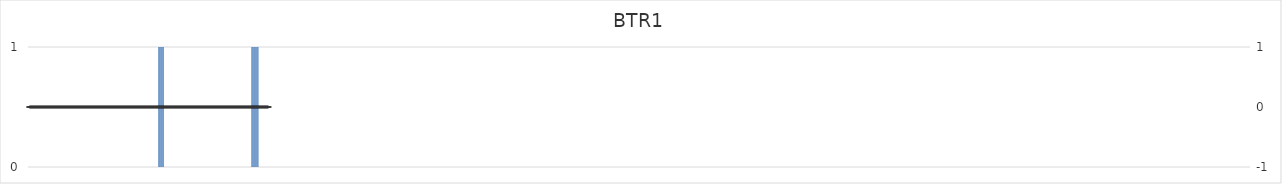
| Category | BTR1 |
|---|---|
| 1.0 | 0 |
| 2.0 | 0 |
| 3.0 | 0 |
| 4.0 | 0 |
| 5.0 | 0 |
| 6.0 | 0 |
| 7.0 | 0 |
| 8.0 | 0 |
| 9.0 | 0 |
| 10.0 | 0 |
| 11.0 | 0 |
| 12.0 | 0 |
| 13.0 | 0 |
| 14.0 | 0 |
| 15.0 | 0 |
| 16.0 | 0 |
| 17.0 | 0 |
| 18.0 | 0 |
| 19.0 | 0 |
| 20.0 | 0 |
| 21.0 | 0 |
| 22.0 | 0 |
| 23.0 | 0 |
| 24.0 | 0 |
| 25.0 | 0 |
| 26.0 | 0 |
| 27.0 | 0 |
| 28.0 | 0 |
| 29.0 | 0 |
| 30.0 | 0 |
| 31.0 | 0 |
| 32.0 | 0 |
| 33.0 | 0 |
| 34.0 | 0 |
| 35.0 | 0 |
| 36.0 | 0 |
| 37.0 | 0 |
| 38.0 | 0 |
| 39.0 | 0 |
| 40.0 | 0 |
| 41.0 | 0 |
| 42.0 | 0 |
| 43.0 | 0 |
| 44.0 | 0 |
| 45.0 | 0 |
| 46.0 | 0 |
| 47.0 | 0 |
| 48.0 | 0 |
| 49.0 | 0 |
| 50.0 | 0 |
| 51.0 | 0 |
| 52.0 | 0 |
| 53.0 | 0 |
| 54.0 | 0 |
| 55.0 | 0 |
| 56.0 | 0 |
| 57.0 | 0 |
| 58.0 | 0 |
| 59.0 | 0 |
| 60.0 | 0 |
| 61.0 | 0 |
| 62.0 | 0 |
| 63.0 | 0 |
| 64.0 | 0 |
| 65.0 | 0 |
| 66.0 | 0 |
| 67.0 | 0 |
| 68.0 | 0 |
| 69.0 | 0 |
| 70.0 | 0 |
| 71.0 | 0 |
| 72.0 | 0 |
| 73.0 | 0 |
| 74.0 | 0 |
| 75.0 | 0 |
| 76.0 | 0 |
| 77.0 | 0 |
| 78.0 | 0 |
| 79.0 | 0 |
| 80.0 | 0 |
| 81.0 | 0 |
| 82.0 | 0 |
| 83.0 | 0 |
| 84.0 | 0 |
| 85.0 | 0 |
| 86.0 | 0 |
| 87.0 | 0 |
| 88.0 | 0 |
| 89.0 | 0 |
| 90.0 | 0 |
| 91.0 | 0 |
| 92.0 | 0 |
| 93.0 | 0 |
| 94.0 | 0 |
| 95.0 | 0 |
| 96.0 | 0 |
| 97.0 | 0 |
| 98.0 | 0 |
| 99.0 | 0 |
| 100.0 | 0 |
| 101.0 | 0 |
| 102.0 | 0 |
| 103.0 | 0 |
| 104.0 | 0 |
| 105.0 | 0 |
| 106.0 | 0 |
| 107.0 | 0 |
| 108.0 | 0 |
| 109.0 | 0 |
| 110.0 | 0 |
| 111.0 | 0 |
| 112.0 | 0 |
| 113.0 | 0 |
| 114.0 | 0 |
| 115.0 | 0 |
| 116.0 | 0 |
| 117.0 | 0 |
| 118.0 | 0 |
| 119.0 | 0 |
| 120.0 | 0 |
| 121.0 | 0 |
| 122.0 | 0 |
| 123.0 | 0 |
| 124.0 | 0 |
| 125.0 | 0 |
| 126.0 | 0 |
| 127.0 | 0 |
| 128.0 | 0 |
| 129.0 | 0 |
| 130.0 | 0 |
| 131.0 | 0 |
| 132.0 | 0 |
| 133.0 | 0 |
| 134.0 | 0 |
| 135.0 | 0 |
| 136.0 | 0 |
| 137.0 | 0 |
| 138.0 | 0 |
| 139.0 | 0 |
| 140.0 | 0 |
| 141.0 | 0 |
| 142.0 | 0 |
| 143.0 | 0 |
| 144.0 | 0 |
| 145.0 | 0 |
| 146.0 | 0 |
| 147.0 | 0 |
| 148.0 | 0 |
| 149.0 | 0 |
| 150.0 | 0 |
| 151.0 | 0 |
| 152.0 | 0 |
| 153.0 | 0 |
| 154.0 | 0 |
| 155.0 | 0 |
| 156.0 | 0 |
| 157.0 | 0 |
| 158.0 | 0 |
| 159.0 | 0 |
| 160.0 | 0 |
| 161.0 | 0 |
| 162.0 | 0 |
| 163.0 | 0 |
| 164.0 | 0 |
| 165.0 | 0 |
| 166.0 | 0 |
| 167.0 | 0 |
| 168.0 | 0 |
| 169.0 | 0 |
| 170.0 | 0 |
| 171.0 | 0 |
| 172.0 | 0 |
| 173.0 | 0 |
| 174.0 | 0 |
| 175.0 | 0 |
| 176.0 | 0 |
| 177.0 | 0 |
| 178.0 | 0 |
| 179.0 | 0 |
| 180.0 | 0 |
| 181.0 | 0 |
| 182.0 | 0 |
| 183.0 | 1 |
| 184.0 | 1 |
| 185.0 | 1 |
| 186.0 | 1 |
| 187.0 | 1 |
| 188.0 | 1 |
| 189.0 | 1 |
| 190.0 | 1 |
| 191.0 | 0 |
| 192.0 | 0 |
| 193.0 | 0 |
| 194.0 | 0 |
| 195.0 | 0 |
| 196.0 | 0 |
| 197.0 | 0 |
| 198.0 | 0 |
| 199.0 | 0 |
| 200.0 | 0 |
| 201.0 | 0 |
| 202.0 | 0 |
| 203.0 | 0 |
| 204.0 | 0 |
| 205.0 | 0 |
| 206.0 | 0 |
| 207.0 | 0 |
| 208.0 | 0 |
| 209.0 | 0 |
| 210.0 | 0 |
| 211.0 | 0 |
| 212.0 | 0 |
| 213.0 | 0 |
| 214.0 | 0 |
| 215.0 | 0 |
| 216.0 | 0 |
| 217.0 | 0 |
| 218.0 | 0 |
| 219.0 | 0 |
| 220.0 | 0 |
| 221.0 | 0 |
| 222.0 | 0 |
| 223.0 | 0 |
| 224.0 | 0 |
| 225.0 | 0 |
| 226.0 | 0 |
| 227.0 | 0 |
| 228.0 | 0 |
| 229.0 | 0 |
| 230.0 | 0 |
| 231.0 | 0 |
| 232.0 | 0 |
| 233.0 | 0 |
| 234.0 | 0 |
| 235.0 | 0 |
| 236.0 | 0 |
| 237.0 | 0 |
| 238.0 | 0 |
| 239.0 | 0 |
| 240.0 | 0 |
| 241.0 | 0 |
| 242.0 | 0 |
| 243.0 | 0 |
| 244.0 | 0 |
| 245.0 | 0 |
| 246.0 | 0 |
| 247.0 | 0 |
| 248.0 | 0 |
| 249.0 | 0 |
| 250.0 | 0 |
| 251.0 | 0 |
| 252.0 | 0 |
| 253.0 | 0 |
| 254.0 | 0 |
| 255.0 | 0 |
| 256.0 | 0 |
| 257.0 | 0 |
| 258.0 | 0 |
| 259.0 | 0 |
| 260.0 | 0 |
| 261.0 | 0 |
| 262.0 | 0 |
| 263.0 | 0 |
| 264.0 | 0 |
| 265.0 | 0 |
| 266.0 | 0 |
| 267.0 | 0 |
| 268.0 | 0 |
| 269.0 | 0 |
| 270.0 | 0 |
| 271.0 | 0 |
| 272.0 | 0 |
| 273.0 | 0 |
| 274.0 | 0 |
| 275.0 | 0 |
| 276.0 | 0 |
| 277.0 | 0 |
| 278.0 | 0 |
| 279.0 | 0 |
| 280.0 | 0 |
| 281.0 | 0 |
| 282.0 | 0 |
| 283.0 | 0 |
| 284.0 | 0 |
| 285.0 | 0 |
| 286.0 | 0 |
| 287.0 | 0 |
| 288.0 | 0 |
| 289.0 | 0 |
| 290.0 | 0 |
| 291.0 | 0 |
| 292.0 | 0 |
| 293.0 | 0 |
| 294.0 | 0 |
| 295.0 | 0 |
| 296.0 | 0 |
| 297.0 | 0 |
| 298.0 | 0 |
| 299.0 | 0 |
| 300.0 | 0 |
| 301.0 | 0 |
| 302.0 | 0 |
| 303.0 | 0 |
| 304.0 | 0 |
| 305.0 | 0 |
| 306.0 | 0 |
| 307.0 | 0 |
| 308.0 | 0 |
| 309.0 | 0 |
| 310.0 | 0 |
| 311.0 | 0 |
| 312.0 | 0 |
| 313.0 | 1 |
| 314.0 | 1 |
| 315.0 | 1 |
| 316.0 | 1 |
| 317.0 | 1 |
| 318.0 | 1 |
| 319.0 | 1 |
| 320.0 | 1 |
| 321.0 | 1 |
| 322.0 | 1 |
| 323.0 | 0 |
| 324.0 | 0 |
| 325.0 | 0 |
| 326.0 | 0 |
| 327.0 | 0 |
| 328.0 | 0 |
| 329.0 | 0 |
| 330.0 | 0 |
| 331.0 | 0 |
| 332.0 | 0 |
| 333.0 | 0 |
| 334.0 | 0 |
| 335.0 | 0 |
| 336.0 | 0 |
| 337.0 | 0 |
| 338.0 | 0 |
| 339.0 | 0 |
| 340.0 | 0 |
| 341.0 | 0 |
| 342.0 | 0 |
| 343.0 | 0 |
| 344.0 | 0 |
| 345.0 | 0 |
| 346.0 | 0 |
| 347.0 | 0 |
| 348.0 | 0 |
| 349.0 | 0 |
| 350.0 | 0 |
| 351.0 | 0 |
| 352.0 | 0 |
| 353.0 | 0 |
| 354.0 | 0 |
| 355.0 | 0 |
| 356.0 | 0 |
| 357.0 | 0 |
| 358.0 | 0 |
| 359.0 | 0 |
| 360.0 | 0 |
| 361.0 | 0 |
| 362.0 | 0 |
| 363.0 | 0 |
| 364.0 | 0 |
| 365.0 | 0 |
| 366.0 | 0 |
| 367.0 | 0 |
| 368.0 | 0 |
| 369.0 | 0 |
| 370.0 | 0 |
| 371.0 | 0 |
| 372.0 | 0 |
| 373.0 | 0 |
| 374.0 | 0 |
| 375.0 | 0 |
| 376.0 | 0 |
| 377.0 | 0 |
| 378.0 | 0 |
| 379.0 | 0 |
| 380.0 | 0 |
| 381.0 | 0 |
| 382.0 | 0 |
| 383.0 | 0 |
| 384.0 | 0 |
| 385.0 | 0 |
| 386.0 | 0 |
| 387.0 | 0 |
| 388.0 | 0 |
| 389.0 | 0 |
| 390.0 | 0 |
| 391.0 | 0 |
| 392.0 | 0 |
| 393.0 | 0 |
| 394.0 | 0 |
| 395.0 | 0 |
| 396.0 | 0 |
| 397.0 | 0 |
| 398.0 | 0 |
| 399.0 | 0 |
| 400.0 | 0 |
| 401.0 | 0 |
| 402.0 | 0 |
| 403.0 | 0 |
| 404.0 | 0 |
| 405.0 | 0 |
| 406.0 | 0 |
| 407.0 | 0 |
| 408.0 | 0 |
| 409.0 | 0 |
| 410.0 | 0 |
| 411.0 | 0 |
| 412.0 | 0 |
| 413.0 | 0 |
| 414.0 | 0 |
| 415.0 | 0 |
| 416.0 | 0 |
| 417.0 | 0 |
| 418.0 | 0 |
| 419.0 | 0 |
| 420.0 | 0 |
| 421.0 | 0 |
| 422.0 | 0 |
| 423.0 | 0 |
| 424.0 | 0 |
| 425.0 | 0 |
| 426.0 | 0 |
| 427.0 | 0 |
| 428.0 | 0 |
| 429.0 | 0 |
| 430.0 | 0 |
| 431.0 | 0 |
| 432.0 | 0 |
| 433.0 | 0 |
| 434.0 | 0 |
| 435.0 | 0 |
| 436.0 | 0 |
| 437.0 | 0 |
| 438.0 | 0 |
| 439.0 | 0 |
| 440.0 | 0 |
| 441.0 | 0 |
| 442.0 | 0 |
| 443.0 | 0 |
| 444.0 | 0 |
| 445.0 | 0 |
| 446.0 | 0 |
| 447.0 | 0 |
| 448.0 | 0 |
| 449.0 | 0 |
| 450.0 | 0 |
| 451.0 | 0 |
| 452.0 | 0 |
| 453.0 | 0 |
| 454.0 | 0 |
| 455.0 | 0 |
| 456.0 | 0 |
| 457.0 | 0 |
| 458.0 | 0 |
| 459.0 | 0 |
| 460.0 | 0 |
| 461.0 | 0 |
| 462.0 | 0 |
| 463.0 | 0 |
| 464.0 | 0 |
| 465.0 | 0 |
| 466.0 | 0 |
| 467.0 | 0 |
| 468.0 | 0 |
| 469.0 | 0 |
| 470.0 | 0 |
| 471.0 | 0 |
| 472.0 | 0 |
| 473.0 | 0 |
| 474.0 | 0 |
| 475.0 | 0 |
| 476.0 | 0 |
| 477.0 | 0 |
| 478.0 | 0 |
| 479.0 | 0 |
| 480.0 | 0 |
| 481.0 | 0 |
| 482.0 | 0 |
| 483.0 | 0 |
| 484.0 | 0 |
| 485.0 | 0 |
| 486.0 | 0 |
| 487.0 | 0 |
| 488.0 | 0 |
| 489.0 | 0 |
| 490.0 | 0 |
| 491.0 | 0 |
| 492.0 | 0 |
| 493.0 | 0 |
| 494.0 | 0 |
| 495.0 | 0 |
| 496.0 | 0 |
| 497.0 | 0 |
| 498.0 | 0 |
| 499.0 | 0 |
| 500.0 | 0 |
| 501.0 | 0 |
| 502.0 | 0 |
| 503.0 | 0 |
| 504.0 | 0 |
| 505.0 | 0 |
| 506.0 | 0 |
| 507.0 | 0 |
| 508.0 | 0 |
| 509.0 | 0 |
| 510.0 | 0 |
| 511.0 | 0 |
| 512.0 | 0 |
| 513.0 | 0 |
| 514.0 | 0 |
| 515.0 | 0 |
| 516.0 | 0 |
| 517.0 | 0 |
| 518.0 | 0 |
| 519.0 | 0 |
| 520.0 | 0 |
| 521.0 | 0 |
| 522.0 | 0 |
| 523.0 | 0 |
| 524.0 | 0 |
| 525.0 | 0 |
| 526.0 | 0 |
| 527.0 | 0 |
| 528.0 | 0 |
| 529.0 | 0 |
| 530.0 | 0 |
| 531.0 | 0 |
| 532.0 | 0 |
| 533.0 | 0 |
| 534.0 | 0 |
| 535.0 | 0 |
| 536.0 | 0 |
| 537.0 | 0 |
| 538.0 | 0 |
| 539.0 | 0 |
| 540.0 | 0 |
| 541.0 | 0 |
| 542.0 | 0 |
| 543.0 | 0 |
| 544.0 | 0 |
| 545.0 | 0 |
| 546.0 | 0 |
| 547.0 | 0 |
| 548.0 | 0 |
| 549.0 | 0 |
| 550.0 | 0 |
| 551.0 | 0 |
| 552.0 | 0 |
| 553.0 | 0 |
| 554.0 | 0 |
| 555.0 | 0 |
| 556.0 | 0 |
| 557.0 | 0 |
| 558.0 | 0 |
| 559.0 | 0 |
| 560.0 | 0 |
| 561.0 | 0 |
| 562.0 | 0 |
| 563.0 | 0 |
| 564.0 | 0 |
| 565.0 | 0 |
| 566.0 | 0 |
| 567.0 | 0 |
| 568.0 | 0 |
| 569.0 | 0 |
| 570.0 | 0 |
| 571.0 | 0 |
| 572.0 | 0 |
| 573.0 | 0 |
| 574.0 | 0 |
| 575.0 | 0 |
| 576.0 | 0 |
| 577.0 | 0 |
| 578.0 | 0 |
| 579.0 | 0 |
| 580.0 | 0 |
| 581.0 | 0 |
| 582.0 | 0 |
| 583.0 | 0 |
| 584.0 | 0 |
| 585.0 | 0 |
| 586.0 | 0 |
| 587.0 | 0 |
| 588.0 | 0 |
| 589.0 | 0 |
| 590.0 | 0 |
| 591.0 | 0 |
| 592.0 | 0 |
| 593.0 | 0 |
| 594.0 | 0 |
| 595.0 | 0 |
| 596.0 | 0 |
| 597.0 | 0 |
| 598.0 | 0 |
| 599.0 | 0 |
| 600.0 | 0 |
| 601.0 | 0 |
| 602.0 | 0 |
| 603.0 | 0 |
| 604.0 | 0 |
| 605.0 | 0 |
| 606.0 | 0 |
| 607.0 | 0 |
| 608.0 | 0 |
| 609.0 | 0 |
| 610.0 | 0 |
| 611.0 | 0 |
| 612.0 | 0 |
| 613.0 | 0 |
| 614.0 | 0 |
| 615.0 | 0 |
| 616.0 | 0 |
| 617.0 | 0 |
| 618.0 | 0 |
| 619.0 | 0 |
| 620.0 | 0 |
| 621.0 | 0 |
| 622.0 | 0 |
| 623.0 | 0 |
| 624.0 | 0 |
| 625.0 | 0 |
| 626.0 | 0 |
| 627.0 | 0 |
| 628.0 | 0 |
| 629.0 | 0 |
| 630.0 | 0 |
| 631.0 | 0 |
| 632.0 | 0 |
| 633.0 | 0 |
| 634.0 | 0 |
| 635.0 | 0 |
| 636.0 | 0 |
| 637.0 | 0 |
| 638.0 | 0 |
| 639.0 | 0 |
| 640.0 | 0 |
| 641.0 | 0 |
| 642.0 | 0 |
| 643.0 | 0 |
| 644.0 | 0 |
| 645.0 | 0 |
| 646.0 | 0 |
| 647.0 | 0 |
| 648.0 | 0 |
| 649.0 | 0 |
| 650.0 | 0 |
| 651.0 | 0 |
| 652.0 | 0 |
| 653.0 | 0 |
| 654.0 | 0 |
| 655.0 | 0 |
| 656.0 | 0 |
| 657.0 | 0 |
| 658.0 | 0 |
| 659.0 | 0 |
| 660.0 | 0 |
| 661.0 | 0 |
| 662.0 | 0 |
| 663.0 | 0 |
| 664.0 | 0 |
| 665.0 | 0 |
| 666.0 | 0 |
| 667.0 | 0 |
| 668.0 | 0 |
| 669.0 | 0 |
| 670.0 | 0 |
| 671.0 | 0 |
| 672.0 | 0 |
| 673.0 | 0 |
| 674.0 | 0 |
| 675.0 | 0 |
| 676.0 | 0 |
| 677.0 | 0 |
| 678.0 | 0 |
| 679.0 | 0 |
| 680.0 | 0 |
| 681.0 | 0 |
| 682.0 | 0 |
| 683.0 | 0 |
| 684.0 | 0 |
| 685.0 | 0 |
| 686.0 | 0 |
| 687.0 | 0 |
| 688.0 | 0 |
| 689.0 | 0 |
| 690.0 | 0 |
| 691.0 | 0 |
| 692.0 | 0 |
| 693.0 | 0 |
| 694.0 | 0 |
| 695.0 | 0 |
| 696.0 | 0 |
| 697.0 | 0 |
| 698.0 | 0 |
| 699.0 | 0 |
| 700.0 | 0 |
| 701.0 | 0 |
| 702.0 | 0 |
| 703.0 | 0 |
| 704.0 | 0 |
| 705.0 | 0 |
| 706.0 | 0 |
| 707.0 | 0 |
| 708.0 | 0 |
| 709.0 | 0 |
| 710.0 | 0 |
| 711.0 | 0 |
| 712.0 | 0 |
| 713.0 | 0 |
| 714.0 | 0 |
| 715.0 | 0 |
| 716.0 | 0 |
| 717.0 | 0 |
| 718.0 | 0 |
| 719.0 | 0 |
| 720.0 | 0 |
| 721.0 | 0 |
| 722.0 | 0 |
| 723.0 | 0 |
| 724.0 | 0 |
| 725.0 | 0 |
| 726.0 | 0 |
| 727.0 | 0 |
| 728.0 | 0 |
| 729.0 | 0 |
| 730.0 | 0 |
| 731.0 | 0 |
| 732.0 | 0 |
| 733.0 | 0 |
| 734.0 | 0 |
| 735.0 | 0 |
| 736.0 | 0 |
| 737.0 | 0 |
| 738.0 | 0 |
| 739.0 | 0 |
| 740.0 | 0 |
| 741.0 | 0 |
| 742.0 | 0 |
| 743.0 | 0 |
| 744.0 | 0 |
| 745.0 | 0 |
| 746.0 | 0 |
| 747.0 | 0 |
| 748.0 | 0 |
| 749.0 | 0 |
| 750.0 | 0 |
| 751.0 | 0 |
| 752.0 | 0 |
| 753.0 | 0 |
| 754.0 | 0 |
| 755.0 | 0 |
| 756.0 | 0 |
| 757.0 | 0 |
| 758.0 | 0 |
| 759.0 | 0 |
| 760.0 | 0 |
| 761.0 | 0 |
| 762.0 | 0 |
| 763.0 | 0 |
| 764.0 | 0 |
| 765.0 | 0 |
| 766.0 | 0 |
| 767.0 | 0 |
| 768.0 | 0 |
| 769.0 | 0 |
| 770.0 | 0 |
| 771.0 | 0 |
| 772.0 | 0 |
| 773.0 | 0 |
| 774.0 | 0 |
| 775.0 | 0 |
| 776.0 | 0 |
| 777.0 | 0 |
| 778.0 | 0 |
| 779.0 | 0 |
| 780.0 | 0 |
| 781.0 | 0 |
| 782.0 | 0 |
| 783.0 | 0 |
| 784.0 | 0 |
| 785.0 | 0 |
| 786.0 | 0 |
| 787.0 | 0 |
| 788.0 | 0 |
| 789.0 | 0 |
| 790.0 | 0 |
| 791.0 | 0 |
| 792.0 | 0 |
| 793.0 | 0 |
| 794.0 | 0 |
| 795.0 | 0 |
| 796.0 | 0 |
| 797.0 | 0 |
| 798.0 | 0 |
| 799.0 | 0 |
| 800.0 | 0 |
| 801.0 | 0 |
| 802.0 | 0 |
| 803.0 | 0 |
| 804.0 | 0 |
| 805.0 | 0 |
| 806.0 | 0 |
| 807.0 | 0 |
| 808.0 | 0 |
| 809.0 | 0 |
| 810.0 | 0 |
| 811.0 | 0 |
| 812.0 | 0 |
| 813.0 | 0 |
| 814.0 | 0 |
| 815.0 | 0 |
| 816.0 | 0 |
| 817.0 | 0 |
| 818.0 | 0 |
| 819.0 | 0 |
| 820.0 | 0 |
| 821.0 | 0 |
| 822.0 | 0 |
| 823.0 | 0 |
| 824.0 | 0 |
| 825.0 | 0 |
| 826.0 | 0 |
| 827.0 | 0 |
| 828.0 | 0 |
| 829.0 | 0 |
| 830.0 | 0 |
| 831.0 | 0 |
| 832.0 | 0 |
| 833.0 | 0 |
| 834.0 | 0 |
| 835.0 | 0 |
| 836.0 | 0 |
| 837.0 | 0 |
| 838.0 | 0 |
| 839.0 | 0 |
| 840.0 | 0 |
| 841.0 | 0 |
| 842.0 | 0 |
| 843.0 | 0 |
| 844.0 | 0 |
| 845.0 | 0 |
| 846.0 | 0 |
| 847.0 | 0 |
| 848.0 | 0 |
| 849.0 | 0 |
| 850.0 | 0 |
| 851.0 | 0 |
| 852.0 | 0 |
| 853.0 | 0 |
| 854.0 | 0 |
| 855.0 | 0 |
| 856.0 | 0 |
| 857.0 | 0 |
| 858.0 | 0 |
| 859.0 | 0 |
| 860.0 | 0 |
| 861.0 | 0 |
| 862.0 | 0 |
| 863.0 | 0 |
| 864.0 | 0 |
| 865.0 | 0 |
| 866.0 | 0 |
| 867.0 | 0 |
| 868.0 | 0 |
| 869.0 | 0 |
| 870.0 | 0 |
| 871.0 | 0 |
| 872.0 | 0 |
| 873.0 | 0 |
| 874.0 | 0 |
| 875.0 | 0 |
| 876.0 | 0 |
| 877.0 | 0 |
| 878.0 | 0 |
| 879.0 | 0 |
| 880.0 | 0 |
| 881.0 | 0 |
| 882.0 | 0 |
| 883.0 | 0 |
| 884.0 | 0 |
| 885.0 | 0 |
| 886.0 | 0 |
| 887.0 | 0 |
| 888.0 | 0 |
| 889.0 | 0 |
| 890.0 | 0 |
| 891.0 | 0 |
| 892.0 | 0 |
| 893.0 | 0 |
| 894.0 | 0 |
| 895.0 | 0 |
| 896.0 | 0 |
| 897.0 | 0 |
| 898.0 | 0 |
| 899.0 | 0 |
| 900.0 | 0 |
| 901.0 | 0 |
| 902.0 | 0 |
| 903.0 | 0 |
| 904.0 | 0 |
| 905.0 | 0 |
| 906.0 | 0 |
| 907.0 | 0 |
| 908.0 | 0 |
| 909.0 | 0 |
| 910.0 | 0 |
| 911.0 | 0 |
| 912.0 | 0 |
| 913.0 | 0 |
| 914.0 | 0 |
| 915.0 | 0 |
| 916.0 | 0 |
| 917.0 | 0 |
| 918.0 | 0 |
| 919.0 | 0 |
| 920.0 | 0 |
| 921.0 | 0 |
| 922.0 | 0 |
| 923.0 | 0 |
| 924.0 | 0 |
| 925.0 | 0 |
| 926.0 | 0 |
| 927.0 | 0 |
| 928.0 | 0 |
| 929.0 | 0 |
| 930.0 | 0 |
| 931.0 | 0 |
| 932.0 | 0 |
| 933.0 | 0 |
| 934.0 | 0 |
| 935.0 | 0 |
| 936.0 | 0 |
| 937.0 | 0 |
| 938.0 | 0 |
| 939.0 | 0 |
| 940.0 | 0 |
| 941.0 | 0 |
| 942.0 | 0 |
| 943.0 | 0 |
| 944.0 | 0 |
| 945.0 | 0 |
| 946.0 | 0 |
| 947.0 | 0 |
| 948.0 | 0 |
| 949.0 | 0 |
| 950.0 | 0 |
| 951.0 | 0 |
| 952.0 | 0 |
| 953.0 | 0 |
| 954.0 | 0 |
| 955.0 | 0 |
| 956.0 | 0 |
| 957.0 | 0 |
| 958.0 | 0 |
| 959.0 | 0 |
| 960.0 | 0 |
| 961.0 | 0 |
| 962.0 | 0 |
| 963.0 | 0 |
| 964.0 | 0 |
| 965.0 | 0 |
| 966.0 | 0 |
| 967.0 | 0 |
| 968.0 | 0 |
| 969.0 | 0 |
| 970.0 | 0 |
| 971.0 | 0 |
| 972.0 | 0 |
| 973.0 | 0 |
| 974.0 | 0 |
| 975.0 | 0 |
| 976.0 | 0 |
| 977.0 | 0 |
| 978.0 | 0 |
| 979.0 | 0 |
| 980.0 | 0 |
| 981.0 | 0 |
| 982.0 | 0 |
| 983.0 | 0 |
| 984.0 | 0 |
| 985.0 | 0 |
| 986.0 | 0 |
| 987.0 | 0 |
| 988.0 | 0 |
| 989.0 | 0 |
| 990.0 | 0 |
| 991.0 | 0 |
| 992.0 | 0 |
| 993.0 | 0 |
| 994.0 | 0 |
| 995.0 | 0 |
| 996.0 | 0 |
| 997.0 | 0 |
| 998.0 | 0 |
| 999.0 | 0 |
| 1000.0 | 0 |
| 1001.0 | 0 |
| 1002.0 | 0 |
| 1003.0 | 0 |
| 1004.0 | 0 |
| 1005.0 | 0 |
| 1006.0 | 0 |
| 1007.0 | 0 |
| 1008.0 | 0 |
| 1009.0 | 0 |
| 1010.0 | 0 |
| 1011.0 | 0 |
| 1012.0 | 0 |
| 1013.0 | 0 |
| 1014.0 | 0 |
| 1015.0 | 0 |
| 1016.0 | 0 |
| 1017.0 | 0 |
| 1018.0 | 0 |
| 1019.0 | 0 |
| 1020.0 | 0 |
| 1021.0 | 0 |
| 1022.0 | 0 |
| 1023.0 | 0 |
| 1024.0 | 0 |
| 1025.0 | 0 |
| 1026.0 | 0 |
| 1027.0 | 0 |
| 1028.0 | 0 |
| 1029.0 | 0 |
| 1030.0 | 0 |
| 1031.0 | 0 |
| 1032.0 | 0 |
| 1033.0 | 0 |
| 1034.0 | 0 |
| 1035.0 | 0 |
| 1036.0 | 0 |
| 1037.0 | 0 |
| 1038.0 | 0 |
| 1039.0 | 0 |
| 1040.0 | 0 |
| 1041.0 | 0 |
| 1042.0 | 0 |
| 1043.0 | 0 |
| 1044.0 | 0 |
| 1045.0 | 0 |
| 1046.0 | 0 |
| 1047.0 | 0 |
| 1048.0 | 0 |
| 1049.0 | 0 |
| 1050.0 | 0 |
| 1051.0 | 0 |
| 1052.0 | 0 |
| 1053.0 | 0 |
| 1054.0 | 0 |
| 1055.0 | 0 |
| 1056.0 | 0 |
| 1057.0 | 0 |
| 1058.0 | 0 |
| 1059.0 | 0 |
| 1060.0 | 0 |
| 1061.0 | 0 |
| 1062.0 | 0 |
| 1063.0 | 0 |
| 1064.0 | 0 |
| 1065.0 | 0 |
| 1066.0 | 0 |
| 1067.0 | 0 |
| 1068.0 | 0 |
| 1069.0 | 0 |
| 1070.0 | 0 |
| 1071.0 | 0 |
| 1072.0 | 0 |
| 1073.0 | 0 |
| 1074.0 | 0 |
| 1075.0 | 0 |
| 1076.0 | 0 |
| 1077.0 | 0 |
| 1078.0 | 0 |
| 1079.0 | 0 |
| 1080.0 | 0 |
| 1081.0 | 0 |
| 1082.0 | 0 |
| 1083.0 | 0 |
| 1084.0 | 0 |
| 1085.0 | 0 |
| 1086.0 | 0 |
| 1087.0 | 0 |
| 1088.0 | 0 |
| 1089.0 | 0 |
| 1090.0 | 0 |
| 1091.0 | 0 |
| 1092.0 | 0 |
| 1093.0 | 0 |
| 1094.0 | 0 |
| 1095.0 | 0 |
| 1096.0 | 0 |
| 1097.0 | 0 |
| 1098.0 | 0 |
| 1099.0 | 0 |
| 1100.0 | 0 |
| 1101.0 | 0 |
| 1102.0 | 0 |
| 1103.0 | 0 |
| 1104.0 | 0 |
| 1105.0 | 0 |
| 1106.0 | 0 |
| 1107.0 | 0 |
| 1108.0 | 0 |
| 1109.0 | 0 |
| 1110.0 | 0 |
| 1111.0 | 0 |
| 1112.0 | 0 |
| 1113.0 | 0 |
| 1114.0 | 0 |
| 1115.0 | 0 |
| 1116.0 | 0 |
| 1117.0 | 0 |
| 1118.0 | 0 |
| 1119.0 | 0 |
| 1120.0 | 0 |
| 1121.0 | 0 |
| 1122.0 | 0 |
| 1123.0 | 0 |
| 1124.0 | 0 |
| 1125.0 | 0 |
| 1126.0 | 0 |
| 1127.0 | 0 |
| 1128.0 | 0 |
| 1129.0 | 0 |
| 1130.0 | 0 |
| 1131.0 | 0 |
| 1132.0 | 0 |
| 1133.0 | 0 |
| 1134.0 | 0 |
| 1135.0 | 0 |
| 1136.0 | 0 |
| 1137.0 | 0 |
| 1138.0 | 0 |
| 1139.0 | 0 |
| 1140.0 | 0 |
| 1141.0 | 0 |
| 1142.0 | 0 |
| 1143.0 | 0 |
| 1144.0 | 0 |
| 1145.0 | 0 |
| 1146.0 | 0 |
| 1147.0 | 0 |
| 1148.0 | 0 |
| 1149.0 | 0 |
| 1150.0 | 0 |
| 1151.0 | 0 |
| 1152.0 | 0 |
| 1153.0 | 0 |
| 1154.0 | 0 |
| 1155.0 | 0 |
| 1156.0 | 0 |
| 1157.0 | 0 |
| 1158.0 | 0 |
| 1159.0 | 0 |
| 1160.0 | 0 |
| 1161.0 | 0 |
| 1162.0 | 0 |
| 1163.0 | 0 |
| 1164.0 | 0 |
| 1165.0 | 0 |
| 1166.0 | 0 |
| 1167.0 | 0 |
| 1168.0 | 0 |
| 1169.0 | 0 |
| 1170.0 | 0 |
| 1171.0 | 0 |
| 1172.0 | 0 |
| 1173.0 | 0 |
| 1174.0 | 0 |
| 1175.0 | 0 |
| 1176.0 | 0 |
| 1177.0 | 0 |
| 1178.0 | 0 |
| 1179.0 | 0 |
| 1180.0 | 0 |
| 1181.0 | 0 |
| 1182.0 | 0 |
| 1183.0 | 0 |
| 1184.0 | 0 |
| 1185.0 | 0 |
| 1186.0 | 0 |
| 1187.0 | 0 |
| 1188.0 | 0 |
| 1189.0 | 0 |
| 1190.0 | 0 |
| 1191.0 | 0 |
| 1192.0 | 0 |
| 1193.0 | 0 |
| 1194.0 | 0 |
| 1195.0 | 0 |
| 1196.0 | 0 |
| 1197.0 | 0 |
| 1198.0 | 0 |
| 1199.0 | 0 |
| 1200.0 | 0 |
| 1201.0 | 0 |
| 1202.0 | 0 |
| 1203.0 | 0 |
| 1204.0 | 0 |
| 1205.0 | 0 |
| 1206.0 | 0 |
| 1207.0 | 0 |
| 1208.0 | 0 |
| 1209.0 | 0 |
| 1210.0 | 0 |
| 1211.0 | 0 |
| 1212.0 | 0 |
| 1213.0 | 0 |
| 1214.0 | 0 |
| 1215.0 | 0 |
| 1216.0 | 0 |
| 1217.0 | 0 |
| 1218.0 | 0 |
| 1219.0 | 0 |
| 1220.0 | 0 |
| 1221.0 | 0 |
| 1222.0 | 0 |
| 1223.0 | 0 |
| 1224.0 | 0 |
| 1225.0 | 0 |
| 1226.0 | 0 |
| 1227.0 | 0 |
| 1228.0 | 0 |
| 1229.0 | 0 |
| 1230.0 | 0 |
| 1231.0 | 0 |
| 1232.0 | 0 |
| 1233.0 | 0 |
| 1234.0 | 0 |
| 1235.0 | 0 |
| 1236.0 | 0 |
| 1237.0 | 0 |
| 1238.0 | 0 |
| 1239.0 | 0 |
| 1240.0 | 0 |
| 1241.0 | 0 |
| 1242.0 | 0 |
| 1243.0 | 0 |
| 1244.0 | 0 |
| 1245.0 | 0 |
| 1246.0 | 0 |
| 1247.0 | 0 |
| 1248.0 | 0 |
| 1249.0 | 0 |
| 1250.0 | 0 |
| 1251.0 | 0 |
| 1252.0 | 0 |
| 1253.0 | 0 |
| 1254.0 | 0 |
| 1255.0 | 0 |
| 1256.0 | 0 |
| 1257.0 | 0 |
| 1258.0 | 0 |
| 1259.0 | 0 |
| 1260.0 | 0 |
| 1261.0 | 0 |
| 1262.0 | 0 |
| 1263.0 | 0 |
| 1264.0 | 0 |
| 1265.0 | 0 |
| 1266.0 | 0 |
| 1267.0 | 0 |
| 1268.0 | 0 |
| 1269.0 | 0 |
| 1270.0 | 0 |
| 1271.0 | 0 |
| 1272.0 | 0 |
| 1273.0 | 0 |
| 1274.0 | 0 |
| 1275.0 | 0 |
| 1276.0 | 0 |
| 1277.0 | 0 |
| 1278.0 | 0 |
| 1279.0 | 0 |
| 1280.0 | 0 |
| 1281.0 | 0 |
| 1282.0 | 0 |
| 1283.0 | 0 |
| 1284.0 | 0 |
| 1285.0 | 0 |
| 1286.0 | 0 |
| 1287.0 | 0 |
| 1288.0 | 0 |
| 1289.0 | 0 |
| 1290.0 | 0 |
| 1291.0 | 0 |
| 1292.0 | 0 |
| 1293.0 | 0 |
| 1294.0 | 0 |
| 1295.0 | 0 |
| 1296.0 | 0 |
| 1297.0 | 0 |
| 1298.0 | 0 |
| 1299.0 | 0 |
| 1300.0 | 0 |
| 1301.0 | 0 |
| 1302.0 | 0 |
| 1303.0 | 0 |
| 1304.0 | 0 |
| 1305.0 | 0 |
| 1306.0 | 0 |
| 1307.0 | 0 |
| 1308.0 | 0 |
| 1309.0 | 0 |
| 1310.0 | 0 |
| 1311.0 | 0 |
| 1312.0 | 0 |
| 1313.0 | 0 |
| 1314.0 | 0 |
| 1315.0 | 0 |
| 1316.0 | 0 |
| 1317.0 | 0 |
| 1318.0 | 0 |
| 1319.0 | 0 |
| 1320.0 | 0 |
| 1321.0 | 0 |
| 1322.0 | 0 |
| 1323.0 | 0 |
| 1324.0 | 0 |
| 1325.0 | 0 |
| 1326.0 | 0 |
| 1327.0 | 0 |
| 1328.0 | 0 |
| 1329.0 | 0 |
| 1330.0 | 0 |
| 1331.0 | 0 |
| 1332.0 | 0 |
| 1333.0 | 0 |
| 1334.0 | 0 |
| 1335.0 | 0 |
| 1336.0 | 0 |
| 1337.0 | 0 |
| 1338.0 | 0 |
| 1339.0 | 0 |
| 1340.0 | 0 |
| 1341.0 | 0 |
| 1342.0 | 0 |
| 1343.0 | 0 |
| 1344.0 | 0 |
| 1345.0 | 0 |
| 1346.0 | 0 |
| 1347.0 | 0 |
| 1348.0 | 0 |
| 1349.0 | 0 |
| 1350.0 | 0 |
| 1351.0 | 0 |
| 1352.0 | 0 |
| 1353.0 | 0 |
| 1354.0 | 0 |
| 1355.0 | 0 |
| 1356.0 | 0 |
| 1357.0 | 0 |
| 1358.0 | 0 |
| 1359.0 | 0 |
| 1360.0 | 0 |
| 1361.0 | 0 |
| 1362.0 | 0 |
| 1363.0 | 0 |
| 1364.0 | 0 |
| 1365.0 | 0 |
| 1366.0 | 0 |
| 1367.0 | 0 |
| 1368.0 | 0 |
| 1369.0 | 0 |
| 1370.0 | 0 |
| 1371.0 | 0 |
| 1372.0 | 0 |
| 1373.0 | 0 |
| 1374.0 | 0 |
| 1375.0 | 0 |
| 1376.0 | 0 |
| 1377.0 | 0 |
| 1378.0 | 0 |
| 1379.0 | 0 |
| 1380.0 | 0 |
| 1381.0 | 0 |
| 1382.0 | 0 |
| 1383.0 | 0 |
| 1384.0 | 0 |
| 1385.0 | 0 |
| 1386.0 | 0 |
| 1387.0 | 0 |
| 1388.0 | 0 |
| 1389.0 | 0 |
| 1390.0 | 0 |
| 1391.0 | 0 |
| 1392.0 | 0 |
| 1393.0 | 0 |
| 1394.0 | 0 |
| 1395.0 | 0 |
| 1396.0 | 0 |
| 1397.0 | 0 |
| 1398.0 | 0 |
| 1399.0 | 0 |
| 1400.0 | 0 |
| 1401.0 | 0 |
| 1402.0 | 0 |
| 1403.0 | 0 |
| 1404.0 | 0 |
| 1405.0 | 0 |
| 1406.0 | 0 |
| 1407.0 | 0 |
| 1408.0 | 0 |
| 1409.0 | 0 |
| 1410.0 | 0 |
| 1411.0 | 0 |
| 1412.0 | 0 |
| 1413.0 | 0 |
| 1414.0 | 0 |
| 1415.0 | 0 |
| 1416.0 | 0 |
| 1417.0 | 0 |
| 1418.0 | 0 |
| 1419.0 | 0 |
| 1420.0 | 0 |
| 1421.0 | 0 |
| 1422.0 | 0 |
| 1423.0 | 0 |
| 1424.0 | 0 |
| 1425.0 | 0 |
| 1426.0 | 0 |
| 1427.0 | 0 |
| 1428.0 | 0 |
| 1429.0 | 0 |
| 1430.0 | 0 |
| 1431.0 | 0 |
| 1432.0 | 0 |
| 1433.0 | 0 |
| 1434.0 | 0 |
| 1435.0 | 0 |
| 1436.0 | 0 |
| 1437.0 | 0 |
| 1438.0 | 0 |
| 1439.0 | 0 |
| 1440.0 | 0 |
| 1441.0 | 0 |
| 1442.0 | 0 |
| 1443.0 | 0 |
| 1444.0 | 0 |
| 1445.0 | 0 |
| 1446.0 | 0 |
| 1447.0 | 0 |
| 1448.0 | 0 |
| 1449.0 | 0 |
| 1450.0 | 0 |
| 1451.0 | 0 |
| 1452.0 | 0 |
| 1453.0 | 0 |
| 1454.0 | 0 |
| 1455.0 | 0 |
| 1456.0 | 0 |
| 1457.0 | 0 |
| 1458.0 | 0 |
| 1459.0 | 0 |
| 1460.0 | 0 |
| 1461.0 | 0 |
| 1462.0 | 0 |
| 1463.0 | 0 |
| 1464.0 | 0 |
| 1465.0 | 0 |
| 1466.0 | 0 |
| 1467.0 | 0 |
| 1468.0 | 0 |
| 1469.0 | 0 |
| 1470.0 | 0 |
| 1471.0 | 0 |
| 1472.0 | 0 |
| 1473.0 | 0 |
| 1474.0 | 0 |
| 1475.0 | 0 |
| 1476.0 | 0 |
| 1477.0 | 0 |
| 1478.0 | 0 |
| 1479.0 | 0 |
| 1480.0 | 0 |
| 1481.0 | 0 |
| 1482.0 | 0 |
| 1483.0 | 0 |
| 1484.0 | 0 |
| 1485.0 | 0 |
| 1486.0 | 0 |
| 1487.0 | 0 |
| 1488.0 | 0 |
| 1489.0 | 0 |
| 1490.0 | 0 |
| 1491.0 | 0 |
| 1492.0 | 0 |
| 1493.0 | 0 |
| 1494.0 | 0 |
| 1495.0 | 0 |
| 1496.0 | 0 |
| 1497.0 | 0 |
| 1498.0 | 0 |
| 1499.0 | 0 |
| 1500.0 | 0 |
| 1501.0 | 0 |
| 1502.0 | 0 |
| 1503.0 | 0 |
| 1504.0 | 0 |
| 1505.0 | 0 |
| 1506.0 | 0 |
| 1507.0 | 0 |
| 1508.0 | 0 |
| 1509.0 | 0 |
| 1510.0 | 0 |
| 1511.0 | 0 |
| 1512.0 | 0 |
| 1513.0 | 0 |
| 1514.0 | 0 |
| 1515.0 | 0 |
| 1516.0 | 0 |
| 1517.0 | 0 |
| 1518.0 | 0 |
| 1519.0 | 0 |
| 1520.0 | 0 |
| 1521.0 | 0 |
| 1522.0 | 0 |
| 1523.0 | 0 |
| 1524.0 | 0 |
| 1525.0 | 0 |
| 1526.0 | 0 |
| 1527.0 | 0 |
| 1528.0 | 0 |
| 1529.0 | 0 |
| 1530.0 | 0 |
| 1531.0 | 0 |
| 1532.0 | 0 |
| 1533.0 | 0 |
| 1534.0 | 0 |
| 1535.0 | 0 |
| 1536.0 | 0 |
| 1537.0 | 0 |
| 1538.0 | 0 |
| 1539.0 | 0 |
| 1540.0 | 0 |
| 1541.0 | 0 |
| 1542.0 | 0 |
| 1543.0 | 0 |
| 1544.0 | 0 |
| 1545.0 | 0 |
| 1546.0 | 0 |
| 1547.0 | 0 |
| 1548.0 | 0 |
| 1549.0 | 0 |
| 1550.0 | 0 |
| 1551.0 | 0 |
| 1552.0 | 0 |
| 1553.0 | 0 |
| 1554.0 | 0 |
| 1555.0 | 0 |
| 1556.0 | 0 |
| 1557.0 | 0 |
| 1558.0 | 0 |
| 1559.0 | 0 |
| 1560.0 | 0 |
| 1561.0 | 0 |
| 1562.0 | 0 |
| 1563.0 | 0 |
| 1564.0 | 0 |
| 1565.0 | 0 |
| 1566.0 | 0 |
| 1567.0 | 0 |
| 1568.0 | 0 |
| 1569.0 | 0 |
| 1570.0 | 0 |
| 1571.0 | 0 |
| 1572.0 | 0 |
| 1573.0 | 0 |
| 1574.0 | 0 |
| 1575.0 | 0 |
| 1576.0 | 0 |
| 1577.0 | 0 |
| 1578.0 | 0 |
| 1579.0 | 0 |
| 1580.0 | 0 |
| 1581.0 | 0 |
| 1582.0 | 0 |
| 1583.0 | 0 |
| 1584.0 | 0 |
| 1585.0 | 0 |
| 1586.0 | 0 |
| 1587.0 | 0 |
| 1588.0 | 0 |
| 1589.0 | 0 |
| 1590.0 | 0 |
| 1591.0 | 0 |
| 1592.0 | 0 |
| 1593.0 | 0 |
| 1594.0 | 0 |
| 1595.0 | 0 |
| 1596.0 | 0 |
| 1597.0 | 0 |
| 1598.0 | 0 |
| 1599.0 | 0 |
| 1600.0 | 0 |
| 1601.0 | 0 |
| 1602.0 | 0 |
| 1603.0 | 0 |
| 1604.0 | 0 |
| 1605.0 | 0 |
| 1606.0 | 0 |
| 1607.0 | 0 |
| 1608.0 | 0 |
| 1609.0 | 0 |
| 1610.0 | 0 |
| 1611.0 | 0 |
| 1612.0 | 0 |
| 1613.0 | 0 |
| 1614.0 | 0 |
| 1615.0 | 0 |
| 1616.0 | 0 |
| 1617.0 | 0 |
| 1618.0 | 0 |
| 1619.0 | 0 |
| 1620.0 | 0 |
| 1621.0 | 0 |
| 1622.0 | 0 |
| 1623.0 | 0 |
| 1624.0 | 0 |
| 1625.0 | 0 |
| 1626.0 | 0 |
| 1627.0 | 0 |
| 1628.0 | 0 |
| 1629.0 | 0 |
| 1630.0 | 0 |
| 1631.0 | 0 |
| 1632.0 | 0 |
| 1633.0 | 0 |
| 1634.0 | 0 |
| 1635.0 | 0 |
| 1636.0 | 0 |
| 1637.0 | 0 |
| 1638.0 | 0 |
| 1639.0 | 0 |
| 1640.0 | 0 |
| 1641.0 | 0 |
| 1642.0 | 0 |
| 1643.0 | 0 |
| 1644.0 | 0 |
| 1645.0 | 0 |
| 1646.0 | 0 |
| 1647.0 | 0 |
| 1648.0 | 0 |
| 1649.0 | 0 |
| 1650.0 | 0 |
| 1651.0 | 0 |
| 1652.0 | 0 |
| 1653.0 | 0 |
| 1654.0 | 0 |
| 1655.0 | 0 |
| 1656.0 | 0 |
| 1657.0 | 0 |
| 1658.0 | 0 |
| 1659.0 | 0 |
| 1660.0 | 0 |
| 1661.0 | 0 |
| 1662.0 | 0 |
| 1663.0 | 0 |
| 1664.0 | 0 |
| 1665.0 | 0 |
| 1666.0 | 0 |
| 1667.0 | 0 |
| 1668.0 | 0 |
| 1669.0 | 0 |
| 1670.0 | 0 |
| 1671.0 | 0 |
| 1672.0 | 0 |
| 1673.0 | 0 |
| 1674.0 | 0 |
| 1675.0 | 0 |
| 1676.0 | 0 |
| 1677.0 | 0 |
| 1678.0 | 0 |
| 1679.0 | 0 |
| 1680.0 | 0 |
| 1681.0 | 0 |
| 1682.0 | 0 |
| 1683.0 | 0 |
| 1684.0 | 0 |
| 1685.0 | 0 |
| 1686.0 | 0 |
| 1687.0 | 0 |
| 1688.0 | 0 |
| 1689.0 | 0 |
| 1690.0 | 0 |
| 1691.0 | 0 |
| 1692.0 | 0 |
| 1693.0 | 0 |
| 1694.0 | 0 |
| 1695.0 | 0 |
| 1696.0 | 0 |
| 1697.0 | 0 |
| 1698.0 | 0 |
| 1699.0 | 0 |
| 1700.0 | 0 |
| 1701.0 | 0 |
| 1702.0 | 0 |
| 1703.0 | 0 |
| 1704.0 | 0 |
| 1705.0 | 0 |
| 1706.0 | 0 |
| 1707.0 | 0 |